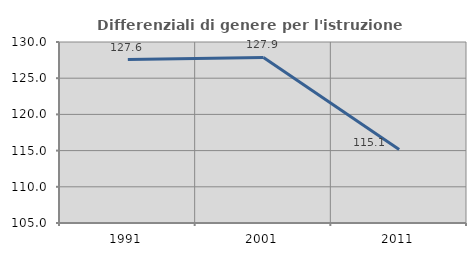
| Category | Differenziali di genere per l'istruzione superiore |
|---|---|
| 1991.0 | 127.57 |
| 2001.0 | 127.862 |
| 2011.0 | 115.146 |